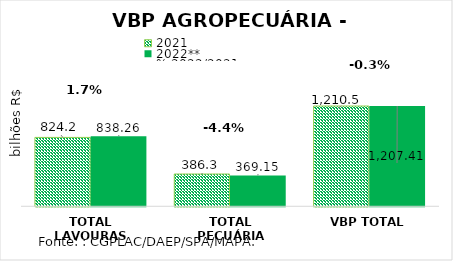
| Category | 2021 | 2022** |
|---|---|---|
| TOTAL LAVOURAS | 824.191 | 838.257 |
| TOTAL PECUÁRIA | 386.268 | 369.151 |
| VBP TOTAL | 1210.459 | 1207.408 |